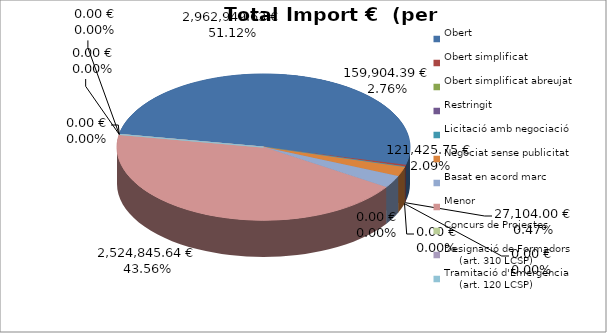
| Category | Total preu
(amb IVA) |
|---|---|
| Obert | 2962949.628 |
| Obert simplificat | 27104 |
| Obert simplificat abreujat | 0 |
| Restringit | 0 |
| Licitació amb negociació | 0 |
| Negociat sense publicitat | 121425.751 |
| Basat en acord marc | 159904.39 |
| Menor | 2524845.64 |
| Concurs de Projectes | 0 |
| Designació de Formadors
     (art. 310 LCSP) | 0 |
| Tramitació d'Emergència
     (art. 120 LCSP) | 0 |